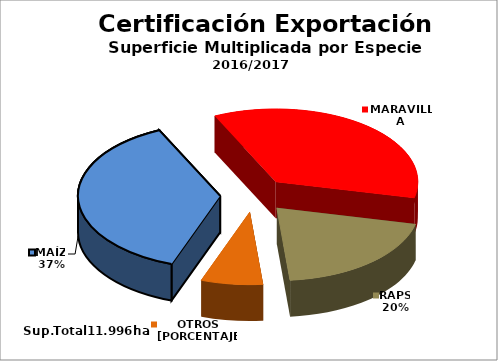
| Category | Series 0 |
|---|---|
| MAÍZ | 4485.24 |
| MARAVILLA | 4272.055 |
| RAPS | 2394.73 |
| OTROS (Avena, Avena Estrigosa, Calabaza, Lupino Azul, Lupino Blanco, Mostaza de Abisinia, Soya, Tabaco, Trébol Encarnado, Trébol Rosado) | 844.298 |